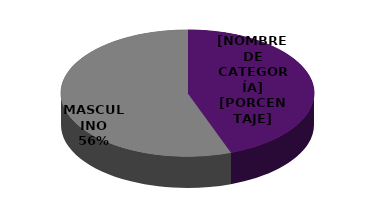
| Category | Series 0 |
|---|---|
| FEMENINO | 8 |
| MASCULINO | 10 |